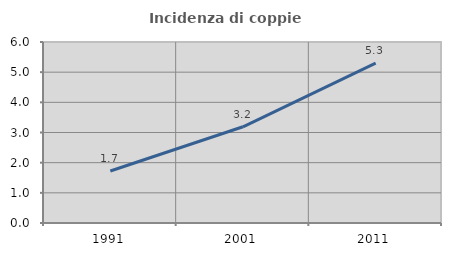
| Category | Incidenza di coppie miste |
|---|---|
| 1991.0 | 1.724 |
| 2001.0 | 3.189 |
| 2011.0 | 5.302 |